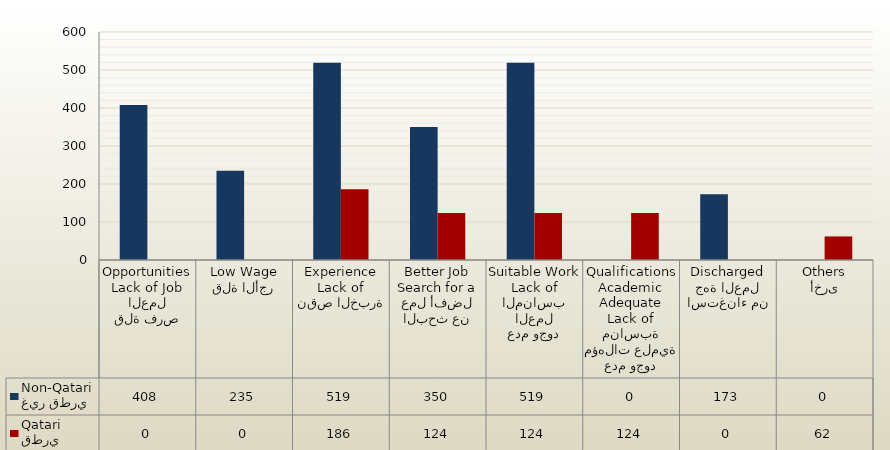
| Category | غير قطري
Non-Qatari | قطري
Qatari |
|---|---|---|
| قلة فرص العمل
Lack of Job Opportunities | 408 | 0 |
| قلة الأجر
Low Wage | 235 | 0 |
| نقص الخبرة
Lack of Experience | 519 | 186 |
| البحث عن عمل أفضل
Search for a Better Job | 350 | 124 |
| عدم وجود العمل المناسب
Lack of Suitable Work | 519 | 124 |
| عدم وجود مؤهلات علمية مناسبة
Lack of Adequate Academic Qualifications | 0 | 124 |
| استغناء من جهة العمل
Discharged | 173 | 0 |
| أخرى
Others | 0 | 62 |